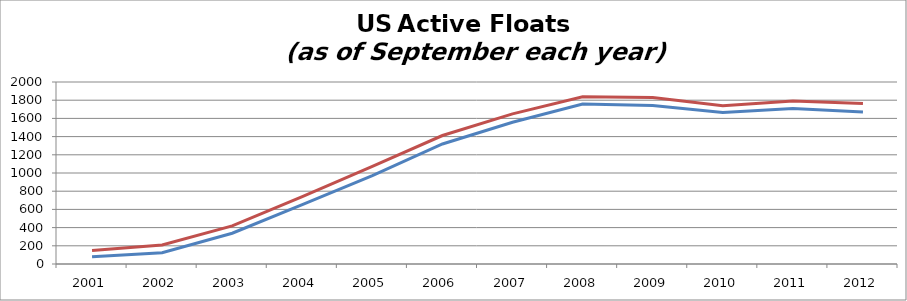
| Category | US Active Floats | US Active Floats with es Program |
|---|---|---|
| 2001.0 | 79 | 148 |
| 2002.0 | 124 | 209 |
| 2003.0 | 338 | 419 |
| 2004.0 | 653 | 741 |
| 2005.0 | 971 | 1072 |
| 2006.0 | 1319 | 1412 |
| 2007.0 | 1557 | 1650 |
| 2008.0 | 1759 | 1837 |
| 2009.0 | 1742 | 1829 |
| 2010.0 | 1666 | 1739 |
| 2011.0 | 1709 | 1791 |
| 2012.0 | 1669 | 1764 |